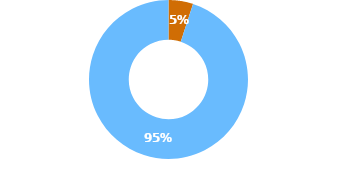
| Category | Series 0 |
|---|---|
| 0 | 3258.571 |
| 1 | 62000 |